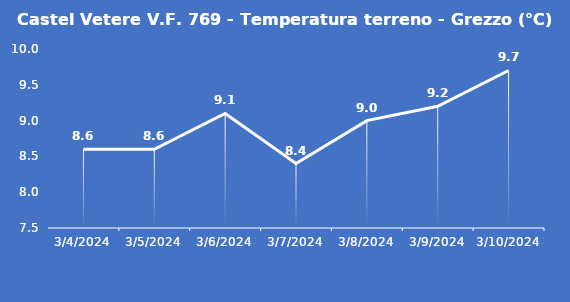
| Category | Castel Vetere V.F. 769 - Temperatura terreno - Grezzo (°C) |
|---|---|
| 3/4/24 | 8.6 |
| 3/5/24 | 8.6 |
| 3/6/24 | 9.1 |
| 3/7/24 | 8.4 |
| 3/8/24 | 9 |
| 3/9/24 | 9.2 |
| 3/10/24 | 9.7 |